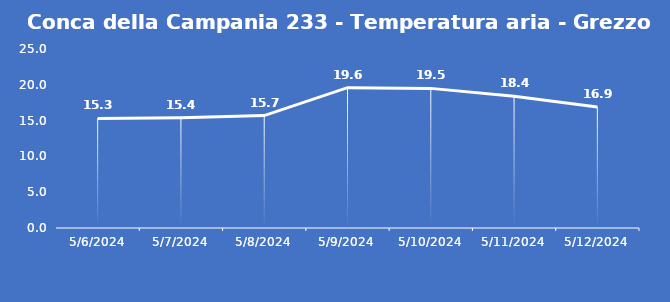
| Category | Conca della Campania 233 - Temperatura aria - Grezzo (°C) |
|---|---|
| 5/6/24 | 15.3 |
| 5/7/24 | 15.4 |
| 5/8/24 | 15.7 |
| 5/9/24 | 19.6 |
| 5/10/24 | 19.5 |
| 5/11/24 | 18.4 |
| 5/12/24 | 16.9 |